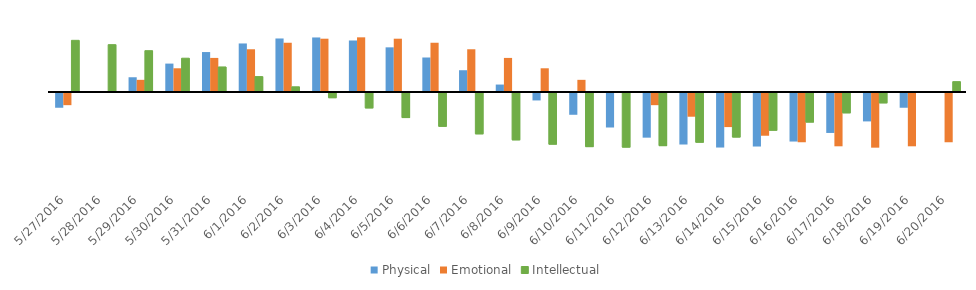
| Category | Physical | Emotional | Intellectual |
|---|---|---|---|
| 5/27/16 | -0.27 | -0.223 | 0.945 |
| 5/28/16 | 0 | 0 | 0.866 |
| 5/29/16 | 0.27 | 0.223 | 0.756 |
| 5/30/16 | 0.52 | 0.434 | 0.618 |
| 5/31/16 | 0.731 | 0.623 | 0.458 |
| 6/1/16 | 0.888 | 0.782 | 0.282 |
| 6/2/16 | 0.979 | 0.901 | 0.095 |
| 6/3/16 | 0.998 | 0.975 | -0.095 |
| 6/4/16 | 0.942 | 1 | -0.282 |
| 6/5/16 | 0.817 | 0.975 | -0.458 |
| 6/6/16 | 0.631 | 0.901 | -0.618 |
| 6/7/16 | 0.398 | 0.782 | -0.756 |
| 6/8/16 | 0.136 | 0.623 | -0.866 |
| 6/9/16 | -0.136 | 0.434 | -0.945 |
| 6/10/16 | -0.398 | 0.223 | -0.99 |
| 6/11/16 | -0.631 | 0 | -0.999 |
| 6/12/16 | -0.817 | -0.223 | -0.972 |
| 6/13/16 | -0.942 | -0.434 | -0.91 |
| 6/14/16 | -0.998 | -0.623 | -0.815 |
| 6/15/16 | -0.979 | -0.782 | -0.69 |
| 6/16/16 | -0.888 | -0.901 | -0.541 |
| 6/17/16 | -0.731 | -0.975 | -0.372 |
| 6/18/16 | -0.52 | -1 | -0.189 |
| 6/19/16 | -0.27 | -0.975 | 0 |
| 6/20/16 | 0 | -0.901 | 0.189 |